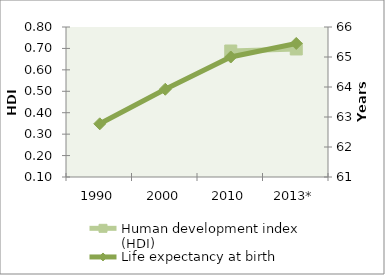
| Category | Human development index (HDI) |
|---|---|
| 1990 | 0 |
| 2000 | 0 |
| 2010 | 0.688 |
| 2013* | 0.698 |